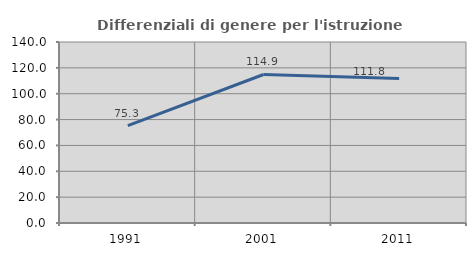
| Category | Differenziali di genere per l'istruzione superiore |
|---|---|
| 1991.0 | 75.325 |
| 2001.0 | 114.877 |
| 2011.0 | 111.831 |